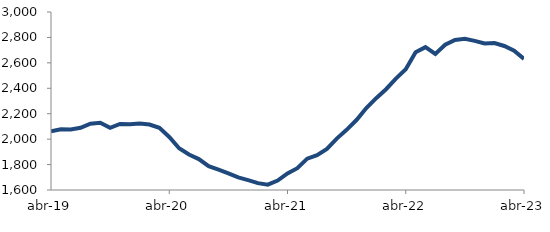
| Category | Series 0 |
|---|---|
| 2019-04-01 | 2060.76 |
| 2019-05-01 | 2078.07 |
| 2019-06-01 | 2076.377 |
| 2019-07-01 | 2089.152 |
| 2019-08-01 | 2121.901 |
| 2019-09-01 | 2128.491 |
| 2019-10-01 | 2088.553 |
| 2019-11-01 | 2119.211 |
| 2019-12-01 | 2116.27 |
| 2020-01-01 | 2123.179 |
| 2020-02-01 | 2115.217 |
| 2020-03-01 | 2088.6 |
| 2020-04-01 | 2017.241 |
| 2020-05-01 | 1928.116 |
| 2020-06-01 | 1878.979 |
| 2020-07-01 | 1843.29 |
| 2020-08-01 | 1787.543 |
| 2020-09-01 | 1760.281 |
| 2020-10-01 | 1731.197 |
| 2020-11-01 | 1698.835 |
| 2020-12-01 | 1677.184 |
| 2021-01-01 | 1654.072 |
| 2021-02-01 | 1641.869 |
| 2021-03-01 | 1673.821 |
| 2021-04-01 | 1730.759 |
| 2021-05-01 | 1771.425 |
| 2021-06-01 | 1846.573 |
| 2021-07-01 | 1874.111 |
| 2021-08-01 | 1922.894 |
| 2021-09-01 | 2004.225 |
| 2021-10-01 | 2073.331 |
| 2021-11-01 | 2150.314 |
| 2021-12-01 | 2244.492 |
| 2022-01-01 | 2321.95 |
| 2022-02-01 | 2392.65 |
| 2022-03-01 | 2476.383 |
| 2022-04-01 | 2549.069 |
| 2022-05-01 | 2683.336 |
| 2022-06-01 | 2723.868 |
| 2022-07-01 | 2670.585 |
| 2022-08-01 | 2742.913 |
| 2022-09-01 | 2780.46 |
| 2022-10-01 | 2788.916 |
| 2022-11-01 | 2772.628 |
| 2022-12-01 | 2752.307 |
| 2023-01-01 | 2755.69 |
| 2023-02-01 | 2732.653 |
| 2023-03-01 | 2696.107 |
| 2023-04-01 | 2631.454 |